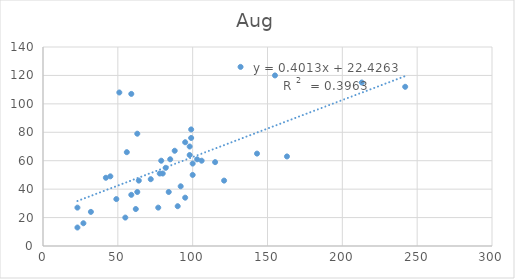
| Category | Aug |
|---|---|
| 23.0 | 13 |
| 23.0 | 27 |
| 27.0 | 16 |
| 32.0 | 24 |
| 45.0 | 49 |
| 49.0 | 33 |
| 92.0 | 42 |
| 55.0 | 20 |
| 121.0 | 46 |
| 63.0 | 38 |
| 42.0 | 48 |
| 77.0 | 27 |
| 78.0 | 51 |
| 62.0 | 26 |
| 63.0 | 79 |
| 85.0 | 61 |
| 100.0 | 58 |
| 90.0 | 28 |
| 56.0 | 66 |
| 98.0 | 70 |
| 82.0 | 55 |
| 100.0 | 50 |
| 115.0 | 59 |
| 80.0 | 51 |
| 59.0 | 107 |
| 79.0 | 60 |
| 84.0 | 38 |
| 99.0 | 82 |
| 143.0 | 65 |
| 132.0 | 126 |
| 95.0 | 73 |
| 98.0 | 64 |
| 95.0 | 34 |
| 99.0 | 76 |
| 72.0 | 47 |
| 51.0 | 108 |
| 88.0 | 67 |
| 163.0 | 63 |
| 103.0 | 61 |
| 59.0 | 36 |
| 106.0 | 60 |
| 64.0 | 46 |
| 213.0 | 115 |
| 242.0 | 112 |
| 155.0 | 120 |